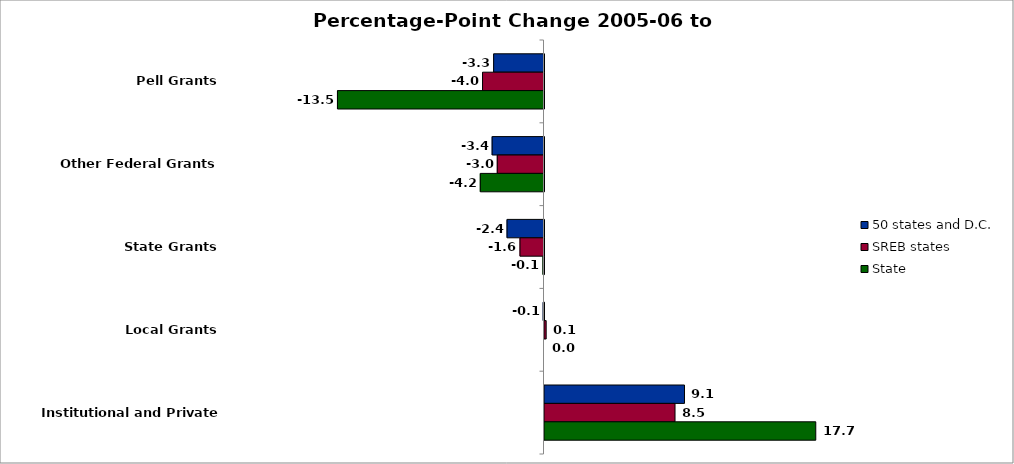
| Category | 50 states and D.C. | SREB states | State |
|---|---|---|---|
| Pell Grants | -3.286 | -4.011 | -13.477 |
| Other Federal Grants | -3.384 | -3.049 | -4.158 |
| State Grants | -2.412 | -1.567 | -0.067 |
| Local Grants | -0.054 | 0.109 | 0 |
| Institutional and Private Grants | 9.135 | 8.518 | 17.701 |